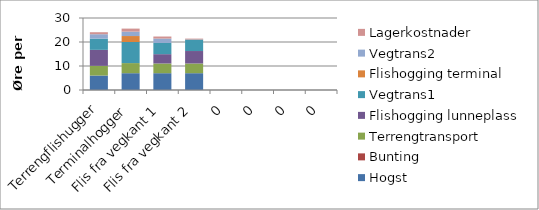
| Category | Hogst | Bunting | Terrengtransport | Flishogging lunneplass | Vegtrans1 | Flishogging terminal | Vegtrans2 | Lagerkostnader |
|---|---|---|---|---|---|---|---|---|
| Terrengflishugger | 6.027 | 0 | 4.041 | 6.66 | 4.673 | 0 | 1.835 | 0.845 |
| Terminalhogger | 7.002 | 0 | 4.21 | 0 | 8.781 | 2.494 | 1.835 | 1.26 |
| Flis fra vegkant 1 | 7.002 | 0 | 4.041 | 3.887 | 4.673 | 0 | 1.835 | 0.845 |
| Flis fra vegkant 2 | 7.002 | 0 | 4.041 | 5.194 | 4.806 | 0 | 0 | 0.368 |
| 0 | 0 | 0 | 0 | 0 | 0 | 0 | 0 | 0 |
| 0 | 0 | 0 | 0 | 0 | 0 | 0 | 0 | 0 |
| 0 | 0 | 0 | 0 | 0 | 0 | 0 | 0 | 0 |
| 0 | 0 | 0 | 0 | 0 | 0 | 0 | 0 | 0 |